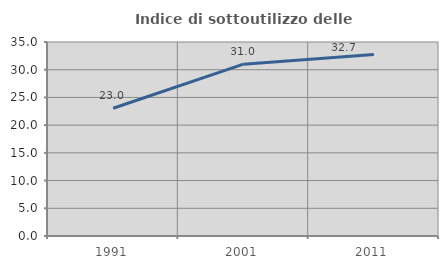
| Category | Indice di sottoutilizzo delle abitazioni  |
|---|---|
| 1991.0 | 23.048 |
| 2001.0 | 31.003 |
| 2011.0 | 32.727 |